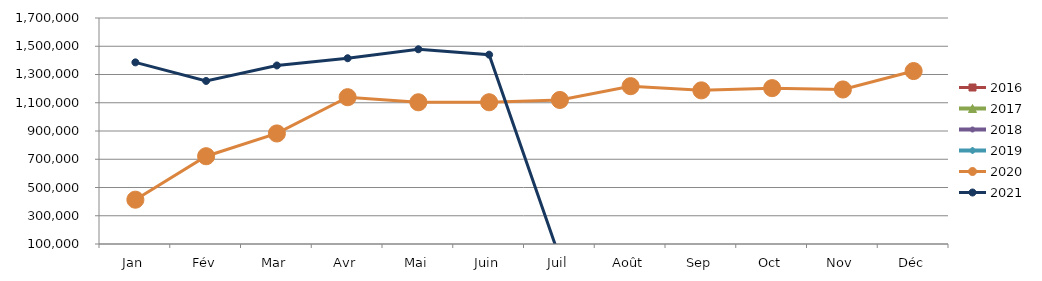
| Category | 2015 | 2016 | 2017 | 2018 | 2019 | 2020 | 2021 |
|---|---|---|---|---|---|---|---|
| Jan |  | 0 | 0 | 0 | 0 | 413718.973 | 1385841.188 |
| Fév |  | 0 | 0 | 0 | 0 | 721421.241 | 1254294.981 |
| Mar |  | 0 | 0 | 0 | 0 | 882604.122 | 1363936.74 |
| Avr |  | 0 | 0 | 0 | 0 | 1139215.204 | 1415132.587 |
| Mai |  | 0 | 0 | 0 | 0 | 1103343.599 | 1478708.989 |
| Juin |  | 0 | 0 | 0 | 0 | 1103576.761 | 1440368.873 |
| Juil |  | 0 | 0 | 0 | 0 | 1119722.736 | 0 |
| Août |  | 0 | 0 | 0 | 0 | 1217354.798 | 0 |
| Sep |  | 0 | 0 | 0 | 0 | 1187669.872 | 0 |
| Oct |  | 0 | 0 | 0 | 0 | 1203449.934 | 0 |
| Nov |  | 0 | 0 | 0 | 0 | 1194014.644 | 0 |
| Déc |  | 0 | 0 | 0 | 0 | 1324311.651 | 0 |